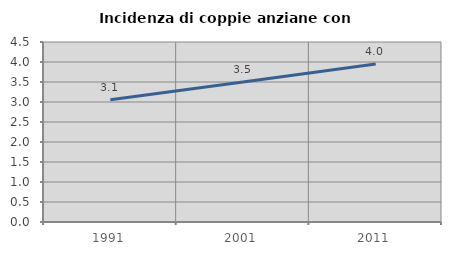
| Category | Incidenza di coppie anziane con figli |
|---|---|
| 1991.0 | 3.059 |
| 2001.0 | 3.498 |
| 2011.0 | 3.951 |